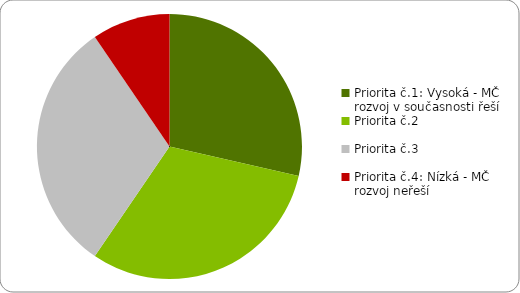
| Category | Series 0 |
|---|---|
| Priorita č.1: Vysoká - MČ rozvoj v současnosti řeší | 12 |
| Priorita č.2 | 13 |
| Priorita č.3 | 13 |
| Priorita č.4: Nízká - MČ rozvoj neřeší | 4 |